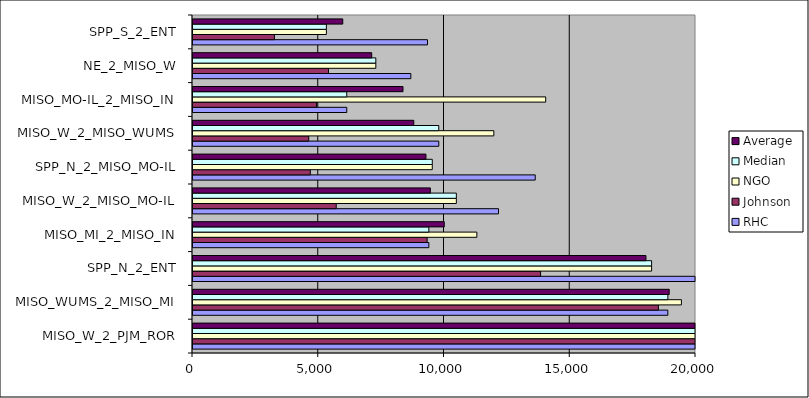
| Category | RHC | Johnson | NGO | Median | Average |
|---|---|---|---|---|---|
| MISO_W_2_PJM_ROR | 44518.563 | 27207.877 | 32762.17 | 32762.17 | 34829.537 |
| MISO_WUMS_2_MISO_MI | 18880.806 | 18504.699 | 19419.85 | 18880.806 | 18935.118 |
| SPP_N_2_ENT | 21973.3 | 13820.711 | 18234.99 | 18234.99 | 18009.667 |
| MISO_MI_2_MISO_IN | 9377.297 | 9309.896 | 11286.37 | 9377.297 | 9991.187 |
| MISO_W_2_MISO_MO-IL | 12147.402 | 5694.558 | 10471.23 | 10471.23 | 9437.73 |
| SPP_N_2_MISO_MO-IL | 13607.838 | 4664.365 | 9513.78 | 9513.78 | 9261.995 |
| MISO_W_2_MISO_WUMS | 9772.029 | 4602.171 | 11961.09 | 9772.029 | 8778.43 |
| MISO_MO-IL_2_MISO_IN | 6113.322 | 4912.048 | 14023.96 | 6113.322 | 8349.777 |
| NE_2_MISO_W | 8661.727 | 5386.004 | 7269.07 | 7269.07 | 7105.601 |
| SPP_S_2_ENT | 9324.303 | 3237.547 | 5302.78 | 5302.78 | 5954.877 |